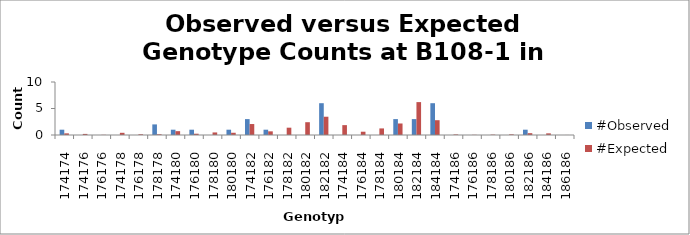
| Category | #Observed | #Expected |
|---|---|---|
| 174174.0 | 1 | 0.31 |
| 174176.0 | 0 | 0.207 |
| 176176.0 | 0 | 0.034 |
| 174178.0 | 0 | 0.414 |
| 176178.0 | 0 | 0.138 |
| 178178.0 | 2 | 0.138 |
| 174180.0 | 1 | 0.724 |
| 176180.0 | 1 | 0.241 |
| 178180.0 | 0 | 0.483 |
| 180180.0 | 1 | 0.422 |
| 174182.0 | 3 | 2.069 |
| 176182.0 | 1 | 0.69 |
| 178182.0 | 0 | 1.379 |
| 180182.0 | 0 | 2.414 |
| 182182.0 | 6 | 3.448 |
| 174184.0 | 0 | 1.862 |
| 176184.0 | 0 | 0.621 |
| 178184.0 | 0 | 1.241 |
| 180184.0 | 3 | 2.172 |
| 182184.0 | 3 | 6.207 |
| 184184.0 | 6 | 2.793 |
| 174186.0 | 0 | 0.103 |
| 176186.0 | 0 | 0.034 |
| 178186.0 | 0 | 0.069 |
| 180186.0 | 0 | 0.121 |
| 182186.0 | 1 | 0.345 |
| 184186.0 | 0 | 0.31 |
| 186186.0 | 0 | 0.009 |